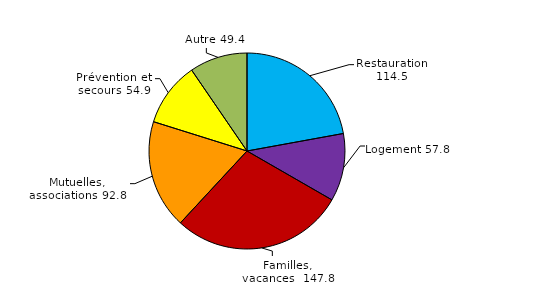
| Category | Series 0 |
|---|---|
| Restauration | 114.5 |
| Logement | 57.8 |
| Familles, vacances  | 147.8 |
| Mutuelles, associations | 92.8 |
| Prévention et secours | 54.9 |
| Autre | 49.4 |